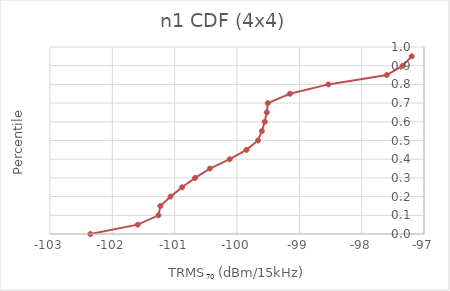
| Category | n1 |
|---|---|
| -102.35332139993984 | 0 |
| -101.59252980835173 | 0.05 |
| -101.2603360403808 | 0.1 |
| -101.22808922716513 | 0.15 |
| -101.06683393620368 | 0.2 |
| -100.88013473083988 | 0.25 |
| -100.67188139712252 | 0.3 |
| -100.43518665692355 | 0.35 |
| -100.11685342730414 | 0.4 |
| -99.84792890283315 | 0.45 |
| -99.6630245384313 | 0.5 |
| -99.60088073741537 | 0.55 |
| -99.5544846404211 | 0.6 |
| -99.52242021995791 | 0.65 |
| -99.50548119058377 | 0.7 |
| -99.1513766949585 | 0.75 |
| -98.5342207049684 | 0.8 |
| -97.59660144531735 | 0.85 |
| -97.34162474507059 | 0.9 |
| -97.19693950194264 | 0.95 |